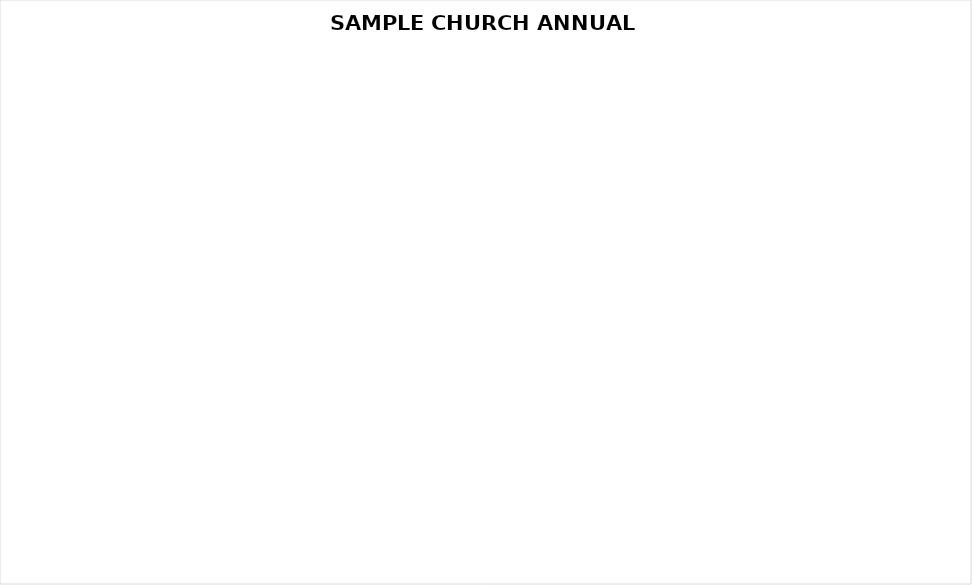
| Category | Series 0 |
|---|---|
| WORSHIP | 0 |
| CONNECTIONS | 0 |
| DISCIPLESHIP & SERVICE | 0 |
| GIVING BEYOND THE CHURCH | 0 |
| MINISTRY SUPPORT & FACILITIES | 0 |